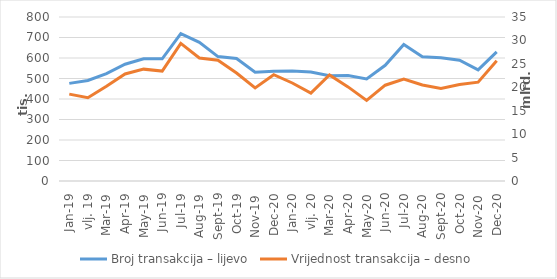
| Category | Broj transakcija – lijevo |
|---|---|
| sij.19 | 476280 |
| vlj. 19 | 490220 |
| ožu.19 | 523506 |
| tra.19 | 569607 |
| svi.19 | 596357 |
| lip.19 | 595773 |
| srp.19 | 718880 |
| kol.19 | 676521 |
| ruj.19 | 606974 |
| lis.19 | 597555 |
| stu.19 | 531100 |
| pro.20 | 535262 |
| sij.20 | 536477 |
| vlj. 20 | 531850 |
| ožu.20 | 513951 |
| tra.20 | 514502 |
| svi.20 | 498228 |
| lip.20 | 564271 |
| srp.20 | 665655 |
| kol.20 | 605764 |
| ruj.20 | 600772 |
| lis.20 | 589410 |
| stu.20 | 542127 |
| pro.20 | 629802 |